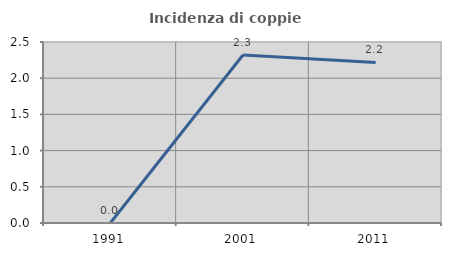
| Category | Incidenza di coppie miste |
|---|---|
| 1991.0 | 0 |
| 2001.0 | 2.32 |
| 2011.0 | 2.218 |